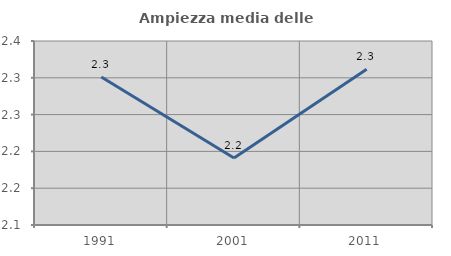
| Category | Ampiezza media delle famiglie |
|---|---|
| 1991.0 | 2.301 |
| 2001.0 | 2.191 |
| 2011.0 | 2.312 |